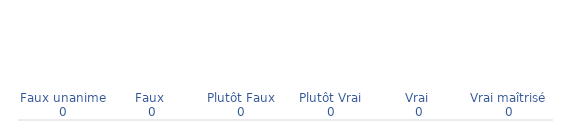
| Category | Niveaux Véracité Critères |
|---|---|
| Faux unanime | 0 |
| Faux  | 0 |
| Plutôt Faux | 0 |
| Plutôt Vrai | 0 |
| Vrai  | 0 |
| Vrai maîtrisé | 0 |